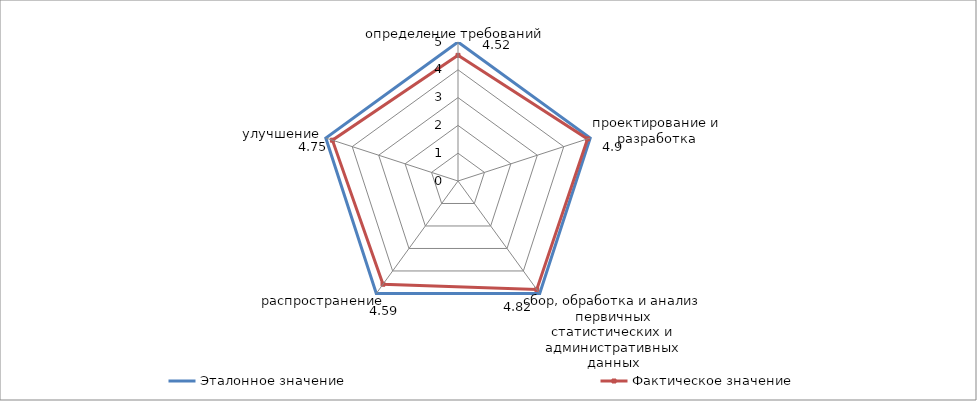
| Category | Эталонное значение | Фактическое значение |
|---|---|---|
| определение требований | 5 | 4.52 |
| проектирование и разработка | 5 | 4.9 |
| сбор, обработка и анализ первичных статистических и административных данных | 5 | 4.82 |
| распространение | 5 | 4.59 |
| улучшение | 5 | 4.75 |